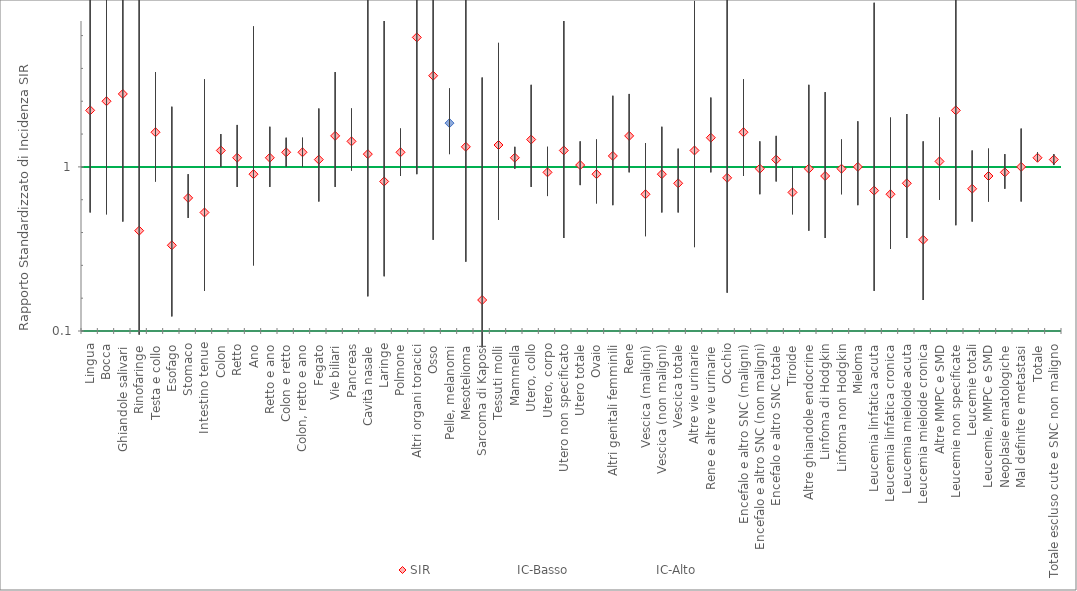
| Category | SIR | IC-Basso | IC-Alto |
|---|---|---|---|
| Lingua | 1.31 | 0.75 | 2.13 |
| Bocca | 1.36 | 0.74 | 2.28 |
| Ghiandole salivari | 1.4 | 0.7 | 2.51 |
| Rinofaringe | 0.65 | 0.08 | 2.34 |
| Testa e collo | 1.19 | 0.92 | 1.52 |
| Esofago | 0.57 | 0.18 | 1.33 |
| Stomaco | 0.83 | 0.72 | 0.96 |
| Intestino tenue | 0.75 | 0.32 | 1.48 |
| Colon | 1.09 | 1 | 1.18 |
| Retto | 1.05 | 0.89 | 1.23 |
| Ano | 0.96 | 0.46 | 1.77 |
| Retto e ano | 1.05 | 0.89 | 1.22 |
| Colon e retto | 1.08 | 1 | 1.16 |
| Colon, retto e ano | 1.08 | 1 | 1.16 |
| Fegato | 1.04 | 0.81 | 1.32 |
| Vie biliari | 1.17 | 0.89 | 1.52 |
| Pancreas | 1.14 | 0.98 | 1.32 |
| Cavità nasale | 1.07 | 0.29 | 2.74 |
| Laringe | 0.92 | 0.4 | 1.8 |
| Polmone | 1.08 | 0.95 | 1.21 |
| Altri organi toracici | 1.71 | 0.96 | 2.83 |
| Osso | 1.5 | 0.6 | 3.09 |
| Pelle, melanomi | 1.24 | 1.07 | 1.43 |
| Mesotelioma | 1.11 | 0.48 | 2.19 |
| Sarcoma di Kaposi | 0.27 | 0.01 | 1.49 |
| Tessuti molli | 1.12 | 0.71 | 1.68 |
| Mammella | 1.05 | 0.99 | 1.11 |
| Utero, collo | 1.15 | 0.89 | 1.45 |
| Utero, corpo | 0.97 | 0.84 | 1.11 |
| Utero non specificato | 1.09 | 0.61 | 1.8 |
| Utero totale | 1.01 | 0.9 | 1.14 |
| Ovaio | 0.96 | 0.8 | 1.15 |
| Altri genitali femminili | 1.06 | 0.79 | 1.39 |
| Rene | 1.17 | 0.97 | 1.4 |
| Vescica (maligni) | 0.85 | 0.62 | 1.13 |
| Vescica (non maligni) | 0.96 | 0.75 | 1.22 |
| Vescica totale | 0.91 | 0.75 | 1.1 |
| Altre vie urinarie | 1.09 | 0.56 | 1.91 |
| Rene e altre vie urinarie | 1.16 | 0.97 | 1.38 |
| Occhio | 0.94 | 0.31 | 2.2 |
| Encefalo e altro SNC (maligni) | 1.19 | 0.95 | 1.48 |
| Encefalo e altro SNC (non maligni) | 0.99 | 0.85 | 1.14 |
| Encefalo e altro SNC totale | 1.04 | 0.92 | 1.17 |
| Tiroide | 0.86 | 0.74 | 1 |
| Altre ghiandole endocrine | 0.99 | 0.65 | 1.45 |
| Linfoma di Hodgkin | 0.95 | 0.61 | 1.41 |
| Linfoma non Hodgkin | 0.99 | 0.85 | 1.15 |
| Mieloma | 1 | 0.79 | 1.25 |
| Leucemia linfatica acuta | 0.87 | 0.32 | 1.9 |
| Leucemia linfatica cronica | 0.85 | 0.55 | 1.27 |
| Leucemia mieloide acuta | 0.91 | 0.61 | 1.29 |
| Leucemia mieloide cronica | 0.6 | 0.27 | 1.14 |
| Altre MMPC e SMD | 1.03 | 0.82 | 1.27 |
| Leucemie non specificate | 1.31 | 0.68 | 2.29 |
| Leucemie totali | 0.88 | 0.7 | 1.09 |
| Leucemie, MMPC e SMD | 0.95 | 0.81 | 1.1 |
| Neoplasie ematologiche | 0.97 | 0.88 | 1.07 |
| Mal definite e metastasi | 1 | 0.81 | 1.21 |
| Totale | 1.05 | 1.03 | 1.08 |
| Totale escluso cute e SNC non maligno | 1.04 | 1.01 | 1.07 |